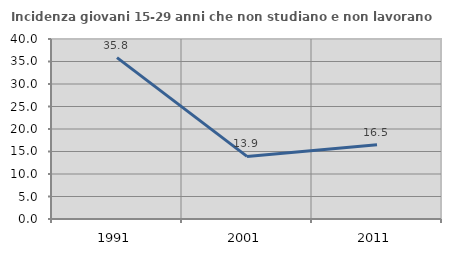
| Category | Incidenza giovani 15-29 anni che non studiano e non lavorano  |
|---|---|
| 1991.0 | 35.849 |
| 2001.0 | 13.91 |
| 2011.0 | 16.486 |